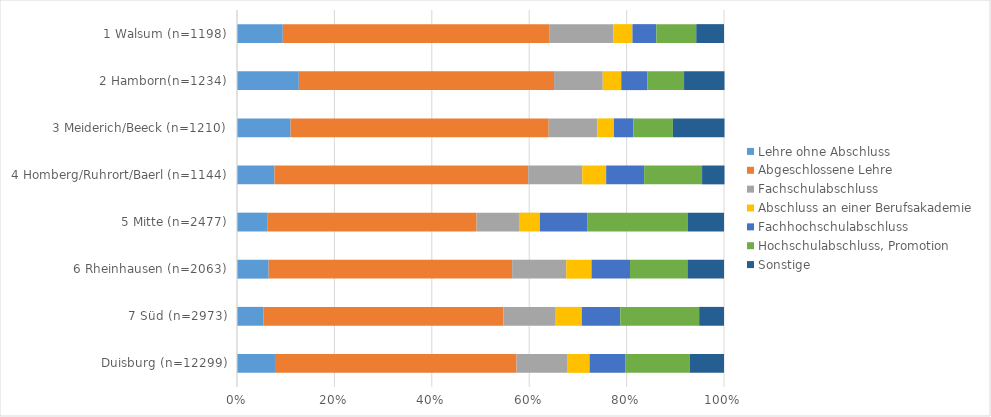
| Category | Lehre ohne Abschluss | Abgeschlossene Lehre | Fachschulabschluss | Abschluss an einer Berufsakademie | Fachhochschulabschluss | Hochschulabschluss, Promotion | Sonstige |
|---|---|---|---|---|---|---|---|
| Duisburg (n=12299) | 0.078 | 0.496 | 0.105 | 0.045 | 0.073 | 0.133 | 0.07 |
| 7 Süd (n=2973) | 0.054 | 0.493 | 0.106 | 0.055 | 0.079 | 0.162 | 0.051 |
| 6 Rheinhausen (n=2063) | 0.065 | 0.5 | 0.111 | 0.052 | 0.079 | 0.118 | 0.075 |
| 5 Mitte (n=2477) | 0.062 | 0.43 | 0.087 | 0.043 | 0.097 | 0.207 | 0.074 |
| 4 Homberg/Ruhrort/Baerl (n=1144) | 0.077 | 0.521 | 0.111 | 0.049 | 0.078 | 0.119 | 0.046 |
| 3 Meiderich/Beeck (n=1210) | 0.11 | 0.53 | 0.1 | 0.034 | 0.04 | 0.081 | 0.106 |
| 2 Hamborn(n=1234) | 0.127 | 0.524 | 0.1 | 0.038 | 0.054 | 0.075 | 0.083 |
| 1 Walsum (n=1198) | 0.094 | 0.547 | 0.132 | 0.039 | 0.049 | 0.082 | 0.057 |